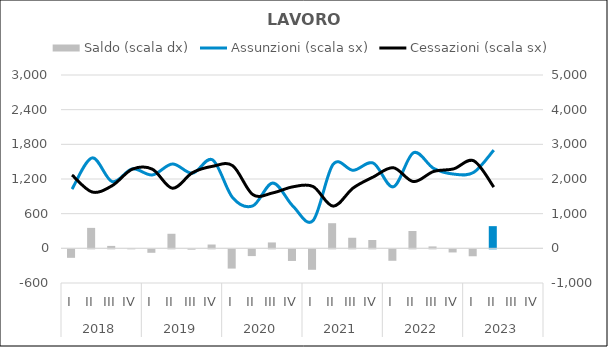
| Category | Saldo (scala dx) |
|---|---|
| 0 | -245 |
| 1 | 590 |
| 2 | 70 |
| 3 | 5 |
| 4 | -100 |
| 5 | 420 |
| 6 | -10 |
| 7 | 110 |
| 8 | -555 |
| 9 | -195 |
| 10 | 170 |
| 11 | -335 |
| 12 | -590 |
| 13 | 725 |
| 14 | 305 |
| 15 | 240 |
| 16 | -330 |
| 17 | 500 |
| 18 | 55 |
| 19 | -90 |
| 20 | -200 |
| 21 | 640 |
| 22 | 0 |
| 23 | 0 |